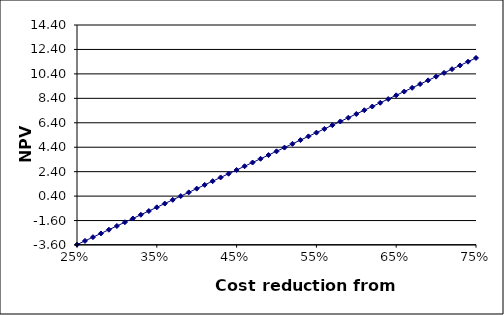
| Category | NPV ratio |
|---|---|
| 0.25 | -3.57 |
| 0.26 | -3.265 |
| 0.27 | -2.96 |
| 0.28 | -2.654 |
| 0.29 | -2.349 |
| 0.3 | -2.043 |
| 0.31 | -1.738 |
| 0.32 | -1.432 |
| 0.33 | -1.127 |
| 0.34 | -0.821 |
| 0.35 | -0.516 |
| 0.36 | -0.21 |
| 0.37 | 0.095 |
| 0.38 | 0.4 |
| 0.39 | 0.706 |
| 0.4 | 1.011 |
| 0.41 | 1.317 |
| 0.42 | 1.622 |
| 0.43 | 1.928 |
| 0.44 | 2.233 |
| 0.45 | 2.539 |
| 0.46 | 2.844 |
| 0.47 | 3.15 |
| 0.48 | 3.455 |
| 0.49 | 3.761 |
| 0.5 | 4.066 |
| 0.51 | 4.371 |
| 0.52 | 4.677 |
| 0.53 | 4.982 |
| 0.54 | 5.288 |
| 0.55 | 5.593 |
| 0.56 | 5.899 |
| 0.57 | 6.204 |
| 0.58 | 6.51 |
| 0.59 | 6.815 |
| 0.6 | 7.121 |
| 0.61 | 7.426 |
| 0.62 | 7.731 |
| 0.63 | 8.037 |
| 0.64 | 8.342 |
| 0.65 | 8.648 |
| 0.66 | 8.953 |
| 0.67 | 9.259 |
| 0.68 | 9.564 |
| 0.69 | 9.87 |
| 0.7 | 10.175 |
| 0.71 | 10.481 |
| 0.72 | 10.786 |
| 0.73 | 11.091 |
| 0.74 | 11.397 |
| 0.75 | 11.702 |